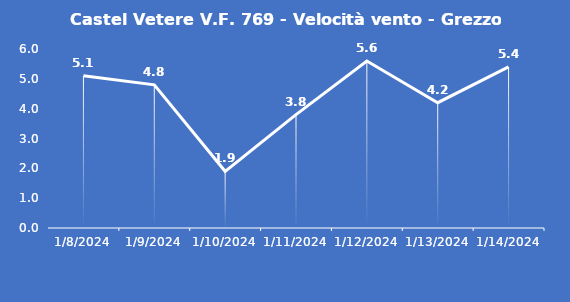
| Category | Castel Vetere V.F. 769 - Velocità vento - Grezzo (m/s) |
|---|---|
| 1/8/24 | 5.1 |
| 1/9/24 | 4.8 |
| 1/10/24 | 1.9 |
| 1/11/24 | 3.8 |
| 1/12/24 | 5.6 |
| 1/13/24 | 4.2 |
| 1/14/24 | 5.4 |